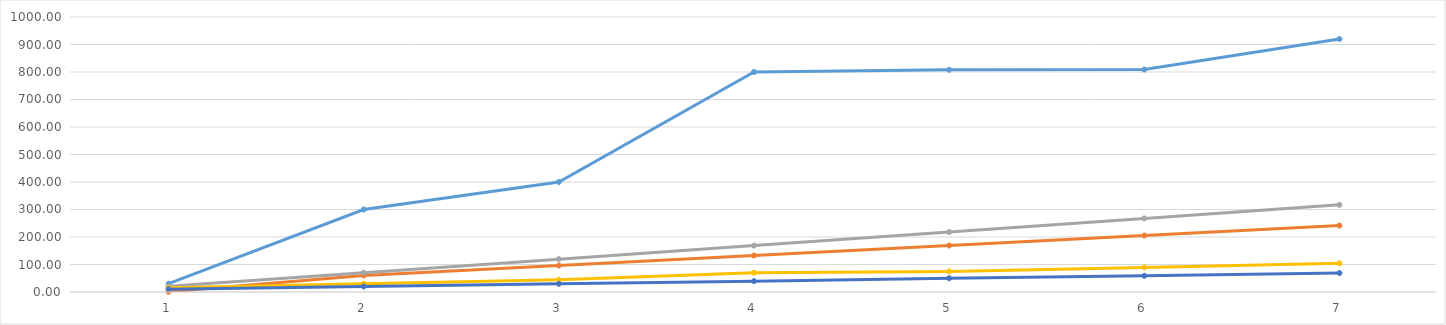
| Category | Кошелек 1 | Кошелек 2 | Кошелек 3 | Кошелек 4 | Кошелек 5 |
|---|---|---|---|---|---|
| 0 | 30.33 | 1 | 20.59 | 15.117 | 10.247 |
| 1 | 300 | 60 | 70 | 30 | 20 |
| 2 | 400 | 96.35 | 119.41 | 44.883 | 29.753 |
| 3 | 800 | 132.7 | 168.82 | 70 | 39.507 |
| 4 | 808 | 169.05 | 218.23 | 74.65 | 50 |
| 5 | 809 | 205.4 | 267.64 | 89.533 | 59.013 |
| 6 | 920 | 241.75 | 317.05 | 104.417 | 68.767 |